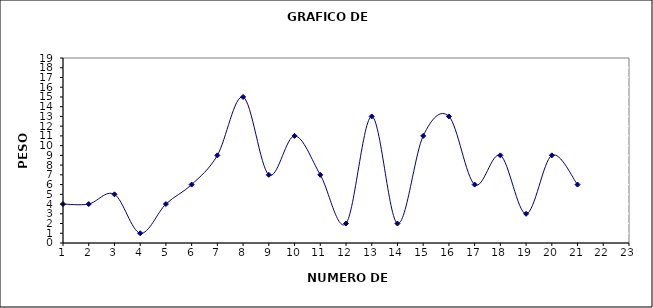
| Category | RANGO |
|---|---|
| 1.0 | 4 |
| 2.0 | 4 |
| 3.0 | 5 |
| 4.0 | 1 |
| 5.0 | 4 |
| 6.0 | 6 |
| 7.0 | 9 |
| 8.0 | 15 |
| 9.0 | 7 |
| 10.0 | 11 |
| 11.0 | 7 |
| 12.0 | 2 |
| 13.0 | 13 |
| 14.0 | 2 |
| 15.0 | 11 |
| 16.0 | 13 |
| 17.0 | 6 |
| 18.0 | 9 |
| 19.0 | 3 |
| 20.0 | 9 |
| 21.0 | 6 |